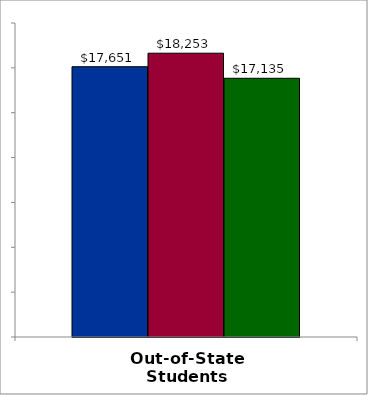
| Category | 50 states and D.C. | SREB states | State |
|---|---|---|---|
| Out-of-State Students | 17651 | 18253 | 17135 |